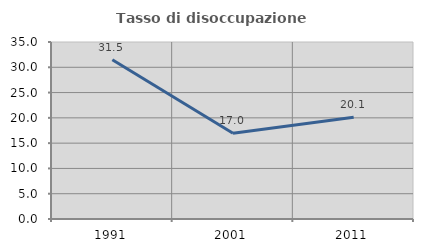
| Category | Tasso di disoccupazione giovanile  |
|---|---|
| 1991.0 | 31.475 |
| 2001.0 | 16.961 |
| 2011.0 | 20.115 |